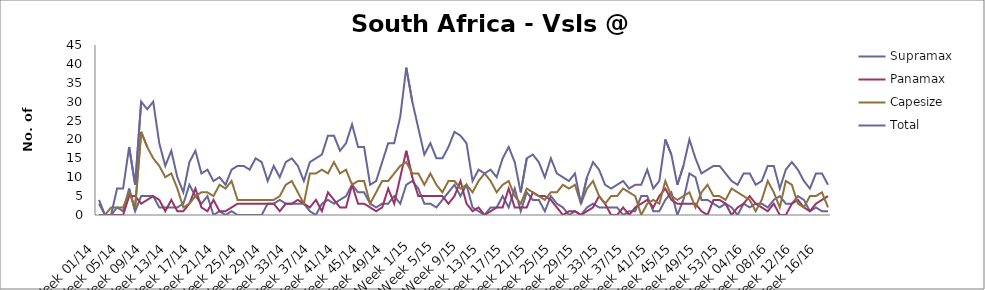
| Category | Supramax | Panamax | Capesize | Total |
|---|---|---|---|---|
| Week 01/14 | 3 | 0 | 0 | 4 |
| Week 02/14 | 0 | 0 | 0 | 0 |
| Week 03/14 | 0 | 0 | 2 | 0 |
| Week 04/14 | 2 | 0 | 2 | 7 |
| Week 05/14 | 1 | 0 | 2 | 7 |
| Week 06/14 | 7 | 5 | 6 | 18 |
| Week 07/14 | 1 | 5 | 2 | 8 |
| Week 08/14 | 5 | 3 | 22 | 30 |
| Week 09/14 | 5 | 4 | 18 | 28 |
| Week 10/14 | 5 | 5 | 15 | 30 |
| Week 11/14 | 2 | 4 | 13 | 19 |
| Week 12/14 | 2 | 1 | 10 | 13 |
| Week 13/14 | 2 | 4 | 11 | 17 |
| Week 14/14 | 2 | 1 | 7 | 10 |
| Week 15/14 | 3 | 1 | 2 | 6 |
| Week 16/14 | 8 | 3 | 3 | 14 |
| Week 17/14 | 5 | 7 | 5 | 17 |
| Week 18/14 | 3 | 2 | 6 | 11 |
| Week 19/14 | 5 | 1 | 6 | 12 |
| Week 20/14 | 0 | 4 | 5 | 9 |
| Week 21/14 | 1 | 1 | 8 | 10 |
| Week 22/14 | 0 | 1 | 7 | 8 |
| Week 23/14 | 1 | 2 | 9 | 12 |
| Week 24/14 | 0 | 3 | 4 | 13 |
| Week 25/14 | 0 | 3 | 4 | 13 |
| Week 26/14 | 0 | 3 | 4 | 12 |
| Week 27/14 | 0 | 3 | 4 | 15 |
| Week 28/14 | 0 | 3 | 4 | 14 |
| Week 29/14 | 3 | 3 | 4 | 9 |
| Week 30/14 | 3 | 3 | 4 | 13 |
| Week 31/14 | 4 | 1 | 5 | 10 |
| Week 32/14 | 3 | 3 | 8 | 14 |
| Week 33/14 | 3 | 3 | 9 | 15 |
| Week 34/14 | 3 | 4 | 6 | 13 |
| Week 35/14 | 3 | 3 | 3 | 9 |
| Week 36/14 | 1 | 2 | 11 | 14 |
| Week 37/14 | 0 | 4 | 11 | 15 |
| Week 38/14 | 3 | 1 | 12 | 16 |
| Week 39/14 | 4 | 6 | 11 | 21 |
| Week 40/14 | 3 | 4 | 14 | 21 |
| Week 41/14 | 4 | 2 | 11 | 17 |
| Week 42/14 | 5 | 2 | 12 | 19 |
| Week 43/14 | 8 | 8 | 8 | 24 |
| Week 44/14 | 6 | 3 | 9 | 18 |
| Week 45/14 | 6 | 3 | 9 | 18 |
| Week 46/14 | 3 | 2 | 3 | 8 |
| Week 47/14 | 2 | 1 | 6 | 9 |
| Week 48/14 | 3 | 2 | 9 | 14 |
| Week 49/14 | 3 | 7 | 9 | 19 |
| Week 50/14 | 5 | 3 | 11 | 19 |
| Week 51/14 | 3 | 10 | 13 | 26 |
| Week 52/14 | 8 | 17 | 14 | 39 |
| Week 1/15 | 9 | 10 | 11 | 30 |
| Week 2/15 | 7 | 5 | 11 | 23 |
| Week 3/15 | 3 | 5 | 8 | 16 |
| Week 4/15 | 3 | 5 | 11 | 19 |
| Week 5/15 | 2 | 5 | 8 | 15 |
| Week 6/15 | 4 | 5 | 6 | 15 |
| Week 7/15 | 6 | 3 | 9 | 18 |
| Week 8/15 | 8 | 5 | 9 | 22 |
| Week 9/15 | 5 | 9 | 7 | 21 |
| Week 10/15 | 8 | 3 | 8 | 19 |
| Week 11/15 | 2 | 1 | 6 | 9 |
| Week 12/15 | 1 | 2 | 9 | 12 |
| Week 13/15 | 0 | 0 | 11 | 11 |
| Week 14/15 | 2 | 1 | 9 | 12 |
| Week 15/15 | 2 | 2 | 6 | 10 |
| Week 16/15 | 5 | 2 | 8 | 15 |
| Week 17/15 | 2 | 7 | 9 | 18 |
| Week 18/15 | 7 | 2 | 5 | 14 |
| Week 19/15 | 1 | 2 | 3 | 6 |
| Week 20/15 | 6 | 2 | 7 | 15 |
| Week 21/15 | 4 | 6 | 6 | 16 |
| Week 22/15 | 4 | 5 | 5 | 14 |
| Week 23/15 | 1 | 5 | 4 | 10 |
| Week 24/15 | 5 | 4 | 6 | 15 |
| Week 25/15 | 3 | 2 | 6 | 11 |
| Week 26/15 | 2 | 0 | 8 | 10 |
| Week 27/15 | 0 | 1 | 7 | 9 |
| Week 28/15 | 1 | 1 | 8 | 11 |
| Week 29/15 | 0 | 0 | 3 | 3 |
| Week 30/15 | 2 | 1 | 7 | 10 |
| Week 31/15 | 3 | 2 | 9 | 14 |
| Week 32/15 | 2 | 5 | 5 | 12 |
| Week 33/15 | 2 | 3 | 3 | 8 |
| Week 34/15 | 2 | 0 | 5 | 7 |
| Week 35/15 | 2 | 0 | 5 | 8 |
| Week 36/15 | 0 | 2 | 7 | 9 |
| Week 37/15 | 1 | 0 | 6 | 7 |
| Week 38/15 | 1 | 2 | 5 | 8 |
| Week 39/15 | 5 | 3 | 0 | 8 |
| Week 40/15 | 5 | 4 | 3 | 12 |
| Week 41/15 | 1 | 2 | 4 | 7 |
| Week 42/15 | 1 | 5 | 3 | 9 |
| Week 43/15 | 4 | 7 | 9 | 20 |
| Week 44/15 | 6 | 4 | 5 | 16 |
| Week 45/15 | 0 | 3 | 4 | 8 |
| Week 46/15 | 4 | 3 | 5 | 13 |
| Week 47/15 | 11 | 3 | 6 | 20 |
| Week 48/15 | 10 | 3 | 2 | 15 |
| Week 49/15 | 4 | 1 | 6 | 11 |
| Week 50/15 | 4 | 0 | 8 | 12 |
| Week 51/15 | 3 | 4 | 5 | 13 |
| Week 52/15 | 2 | 4 | 5 | 13 |
| Week 53/15 | 3 | 3 | 4 | 11 |
| Week 01/16 | 2 | 0 | 7 | 9 |
| Week 02/16 | 0 | 2 | 6 | 8 |
| Week 03/16 | 3 | 3 | 5 | 11 |
| Week 04/16 | 2 | 5 | 4 | 11 |
| Week 05/16 | 3 | 3 | 1 | 8 |
| Week 06/16 | 3 | 2 | 4 | 9 |
| Week 07/16 | 2 | 1 | 9 | 13 |
| Week 08/16 | 4 | 3 | 6 | 13 |
| Week 09/16 | 5 | 0 | 2 | 7 |
| Week 10/16 | 3 | 0 | 9 | 12 |
| Week 11/16 | 3 | 3 | 8 | 14 |
| Week 12/16 | 5 | 4 | 3 | 12 |
| Week 13/16 | 4 | 2 | 2 | 9 |
| Week 14/16 | 1 | 1 | 5 | 7 |
| Week 15/16 | 2 | 3 | 5 | 11 |
| Week 16/16 | 1 | 4 | 6 | 11 |
| Week 17/16 | 1 | 5 | 2 | 8 |